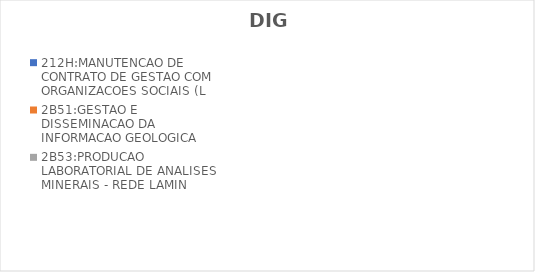
| Category | 212H:MANUTENCAO DE CONTRATO DE GESTAO COM ORGANIZACOES SOCIAIS (L | 2B51:GESTAO E DISSEMINACAO DA INFORMACAO GEOLOGICA | 2B53:PRODUCAO LABORATORIAL DE ANALISES MINERAIS - REDE LAMIN |
|---|---|---|---|
| EXECUTADO | 0 | 0.698 | 0.335 |